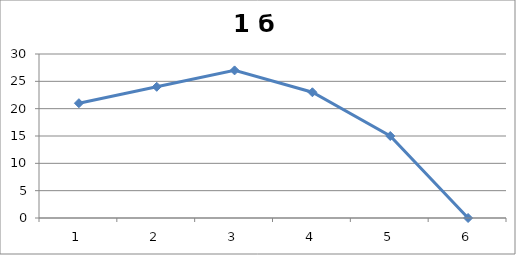
| Category | 3 класс |
|---|---|
| 0 | 21 |
| 1 | 24 |
| 2 | 27 |
| 3 | 23 |
| 4 | 15 |
| 5 | 0 |